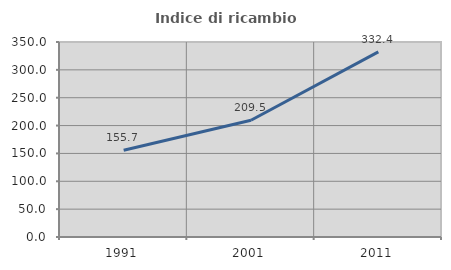
| Category | Indice di ricambio occupazionale  |
|---|---|
| 1991.0 | 155.714 |
| 2001.0 | 209.524 |
| 2011.0 | 332.353 |